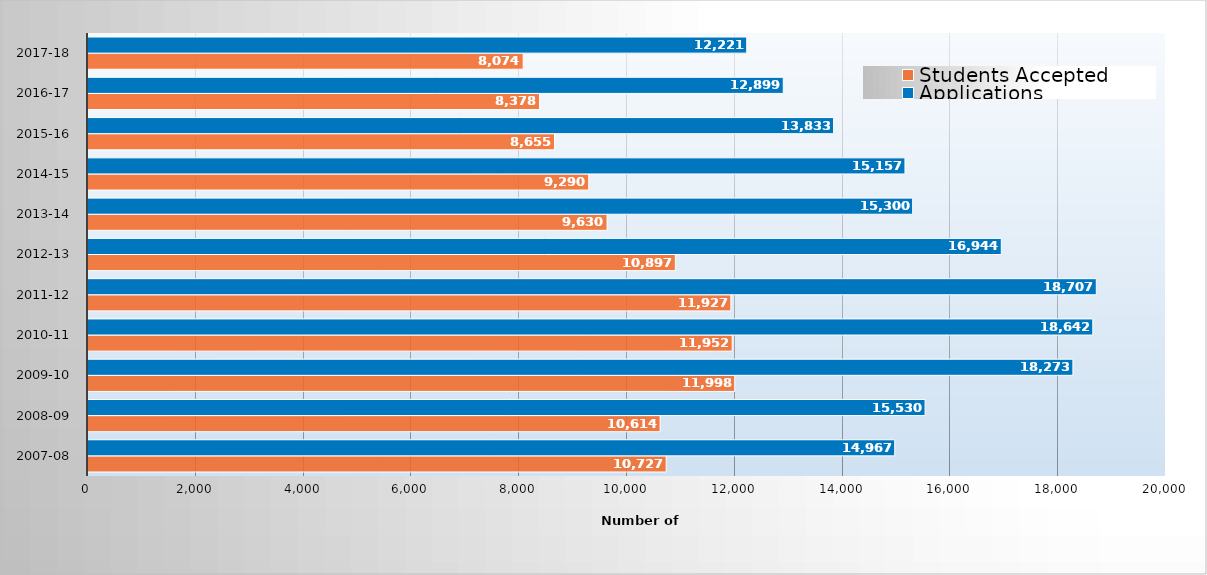
| Category | Students Accepted | Applications |
|---|---|---|
| 2007-08 | 10727 | 14967 |
| 2008-09 | 10614 | 15530 |
| 2009-10 | 11998 | 18273 |
| 2010-11 | 11952 | 18642 |
| 2011-12 | 11927 | 18707 |
| 2012-13 | 10897 | 16944 |
| 2013-14 | 9630 | 15300 |
| 2014-15 | 9290 | 15157 |
| 2015-16 | 8655 | 13833 |
| 2016-17 | 8378 | 12899 |
| 2017-18 | 8074 | 12221 |